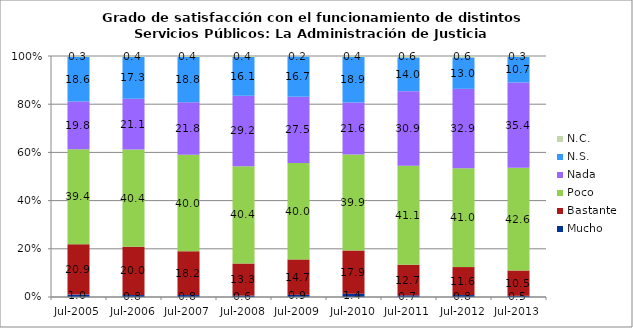
| Category | Mucho | Bastante | Poco | Nada | N.S. | N.C. |
|---|---|---|---|---|---|---|
| Jul-2005 | 1 | 20.9 | 39.4 | 19.8 | 18.6 | 0.3 |
| Jul-2006 | 0.8 | 20 | 40.4 | 21.1 | 17.3 | 0.4 |
| Jul-2007 | 0.8 | 18.2 | 40 | 21.8 | 18.8 | 0.4 |
| Jul-2008 | 0.6 | 13.3 | 40.4 | 29.2 | 16.1 | 0.4 |
| Jul-2009 | 0.9 | 14.7 | 40 | 27.5 | 16.7 | 0.2 |
| Jul-2010 | 1.4 | 17.9 | 39.9 | 21.6 | 18.9 | 0.4 |
| Jul-2011 | 0.7 | 12.7 | 41.1 | 30.9 | 14 | 0.6 |
| Jul-2012 | 0.8 | 11.6 | 41 | 32.9 | 13 | 0.6 |
| Jul-2013 | 0.5 | 10.5 | 42.6 | 35.4 | 10.7 | 0.3 |